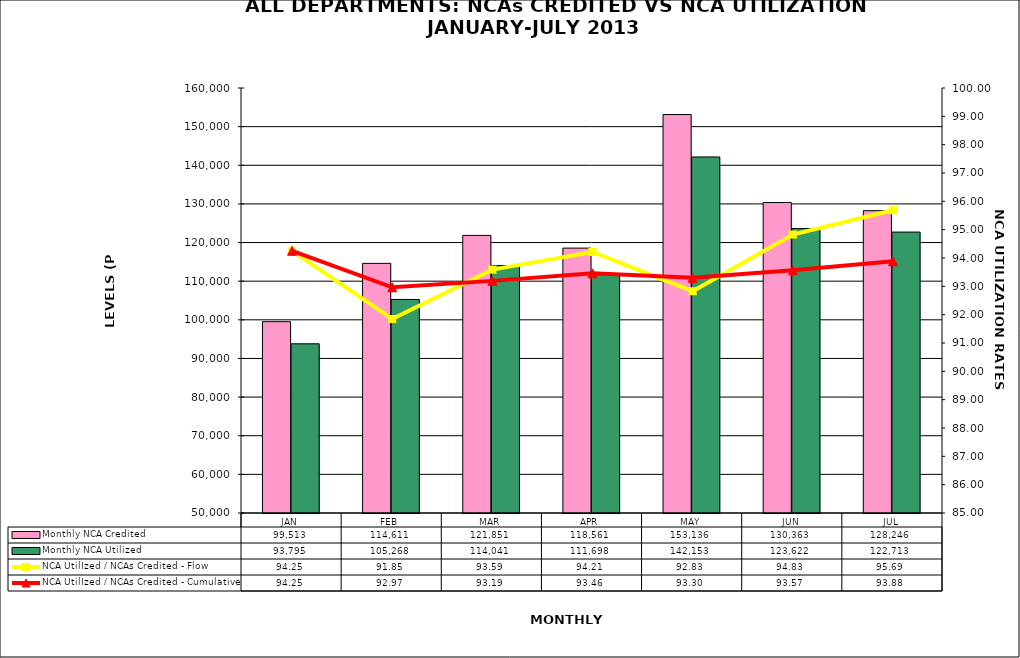
| Category | Monthly NCA Credited | Monthly NCA Utilized |
|---|---|---|
| JAN | 99513.083 | 93795.169 |
| FEB | 114611.135 | 105267.676 |
| MAR | 121850.757 | 114041.352 |
| APR | 118560.897 | 111698.077 |
| MAY | 153136.136 | 142152.808 |
| JUN | 130363.295 | 123621.517 |
| JUL | 128245.743 | 122712.666 |